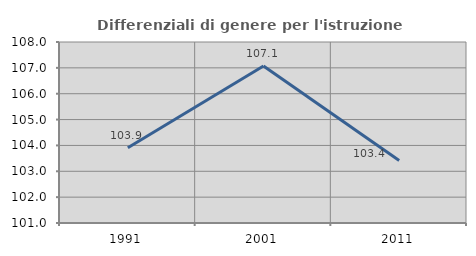
| Category | Differenziali di genere per l'istruzione superiore |
|---|---|
| 1991.0 | 103.909 |
| 2001.0 | 107.07 |
| 2011.0 | 103.416 |